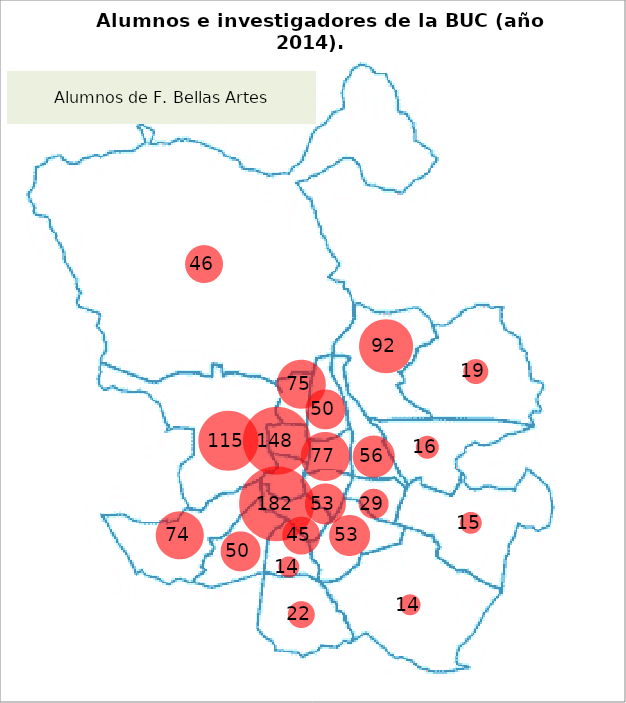
| Category | Series 1 |
|---|---|
| 11.0 | 6 |
| 12.0 | 5 |
| 13.0 | 6 |
| 13.0 | 7.5 |
| 13.0 | 9 |
| 12.0 | 9.8 |
| 11.0 | 8 |
| 8.0 | 13.6 |
| 9.0 | 8 |
| 7.0 | 5 |
| 9.5 | 4.5 |
| 11.5 | 4 |
| 14.0 | 5 |
| 15.0 | 6 |
| 15.0 | 7.5 |
| 15.5 | 11 |
| 12.0 | 2.5 |
| 16.5 | 2.8 |
| 19.0 | 5.4 |
| 17.2 | 7.8 |
| 19.2 | 10.2 |